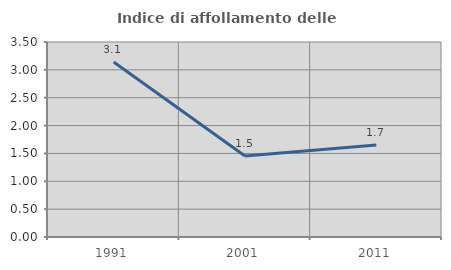
| Category | Indice di affollamento delle abitazioni  |
|---|---|
| 1991.0 | 3.14 |
| 2001.0 | 1.452 |
| 2011.0 | 1.652 |